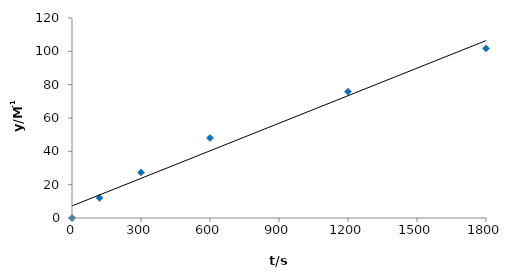
| Category | Series 0 |
|---|---|
| 0.0 | 0 |
| 120.0 | 12.038 |
| 300.0 | 27.372 |
| 600.0 | 48.014 |
| 1200.0 | 75.809 |
| 1800.0 | 101.775 |